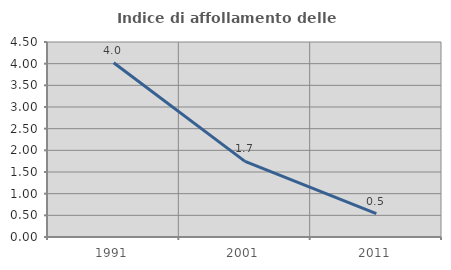
| Category | Indice di affollamento delle abitazioni  |
|---|---|
| 1991.0 | 4.02 |
| 2001.0 | 1.745 |
| 2011.0 | 0.538 |